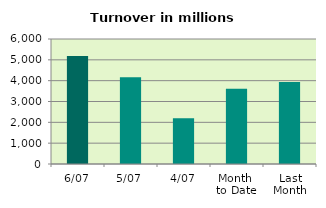
| Category | Series 0 |
|---|---|
| 6/07 | 5179.554 |
| 5/07 | 4166.721 |
| 4/07 | 2201.5 |
| Month 
to Date | 3617.204 |
| Last
Month | 3940.311 |